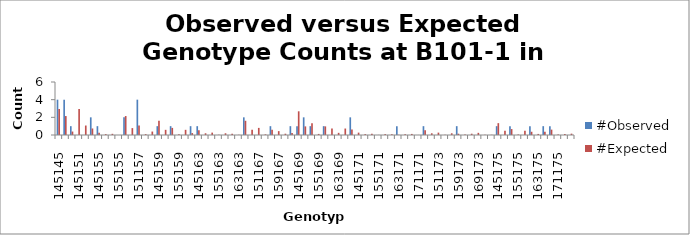
| Category | #Observed | #Expected |
|---|---|---|
| 145145.0 | 4 | 2.951 |
| 145149.0 | 4 | 2.146 |
| 149149.0 | 1 | 0.39 |
| 145151.0 | 0 | 2.951 |
| 149151.0 | 0 | 1.073 |
| 151151.0 | 2 | 0.738 |
| 145155.0 | 1 | 0.268 |
| 149155.0 | 0 | 0.098 |
| 151155.0 | 0 | 0.134 |
| 155155.0 | 0 | 0.006 |
| 145157.0 | 2 | 2.146 |
| 149157.0 | 0 | 0.78 |
| 151157.0 | 4 | 1.073 |
| 155157.0 | 0 | 0.098 |
| 157157.0 | 0 | 0.39 |
| 145159.0 | 1 | 1.61 |
| 149159.0 | 0 | 0.585 |
| 151159.0 | 1 | 0.805 |
| 155159.0 | 0 | 0.073 |
| 157159.0 | 0 | 0.585 |
| 159159.0 | 1 | 0.22 |
| 145163.0 | 1 | 0.537 |
| 149163.0 | 0 | 0.195 |
| 151163.0 | 0 | 0.268 |
| 155163.0 | 0 | 0.024 |
| 157163.0 | 0 | 0.195 |
| 159163.0 | 0 | 0.146 |
| 163163.0 | 0 | 0.024 |
| 145167.0 | 2 | 1.61 |
| 149167.0 | 0 | 0.585 |
| 151167.0 | 0 | 0.805 |
| 155167.0 | 0 | 0.073 |
| 157167.0 | 1 | 0.585 |
| 159167.0 | 0 | 0.439 |
| 163167.0 | 0 | 0.146 |
| 167167.0 | 1 | 0.22 |
| 145169.0 | 1 | 2.683 |
| 149169.0 | 2 | 0.976 |
| 151169.0 | 1 | 1.341 |
| 155169.0 | 0 | 0.122 |
| 157169.0 | 1 | 0.976 |
| 159169.0 | 0 | 0.732 |
| 163169.0 | 0 | 0.244 |
| 167169.0 | 0 | 0.732 |
| 169169.0 | 2 | 0.61 |
| 145171.0 | 0 | 0.268 |
| 149171.0 | 0 | 0.098 |
| 151171.0 | 0 | 0.134 |
| 155171.0 | 0 | 0.012 |
| 157171.0 | 0 | 0.098 |
| 159171.0 | 0 | 0.073 |
| 163171.0 | 1 | 0.024 |
| 167171.0 | 0 | 0.073 |
| 169171.0 | 0 | 0.122 |
| 171171.0 | 0 | 0.006 |
| 145173.0 | 1 | 0.537 |
| 149173.0 | 0 | 0.195 |
| 151173.0 | 0 | 0.268 |
| 155173.0 | 0 | 0.024 |
| 157173.0 | 0 | 0.195 |
| 159173.0 | 1 | 0.146 |
| 163173.0 | 0 | 0.049 |
| 167173.0 | 0 | 0.146 |
| 169173.0 | 0 | 0.244 |
| 171173.0 | 0 | 0.024 |
| 173173.0 | 0 | 0.024 |
| 145175.0 | 1 | 1.341 |
| 149175.0 | 0 | 0.488 |
| 151175.0 | 1 | 0.671 |
| 155175.0 | 0 | 0.061 |
| 157175.0 | 0 | 0.488 |
| 159175.0 | 1 | 0.366 |
| 163175.0 | 0 | 0.122 |
| 167175.0 | 1 | 0.366 |
| 169175.0 | 1 | 0.61 |
| 171175.0 | 0 | 0.061 |
| 173175.0 | 0 | 0.122 |
| 175175.0 | 0 | 0.152 |